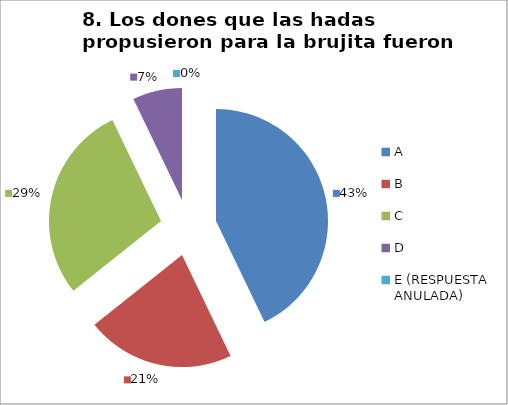
| Category | CANTIDAD DE RESPUESTAS PREGUNTA (8) | PORCENTAJE |
|---|---|---|
| A | 12 | 0.429 |
| B | 6 | 0.214 |
| C | 8 | 0.286 |
| D | 2 | 0.071 |
| E (RESPUESTA ANULADA) | 0 | 0 |